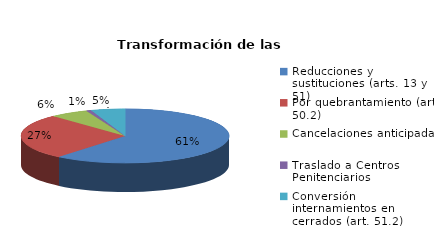
| Category | Series 0 |
|---|---|
| Reducciones y sustituciones (arts. 13 y 51) | 243 |
| Por quebrantamiento (art. 50.2) | 108 |
| Cancelaciones anticipadas | 24 |
| Traslado a Centros Penitenciarios | 3 |
| Conversión internamientos en cerrados (art. 51.2) | 21 |